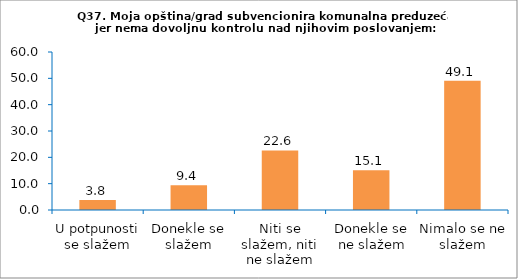
| Category | Series 0 |
|---|---|
| U potpunosti se slažem | 3.774 |
| Donekle se slažem | 9.434 |
| Niti se slažem, niti ne slažem | 22.642 |
| Donekle se ne slažem | 15.094 |
| Nimalo se ne slažem | 49.057 |